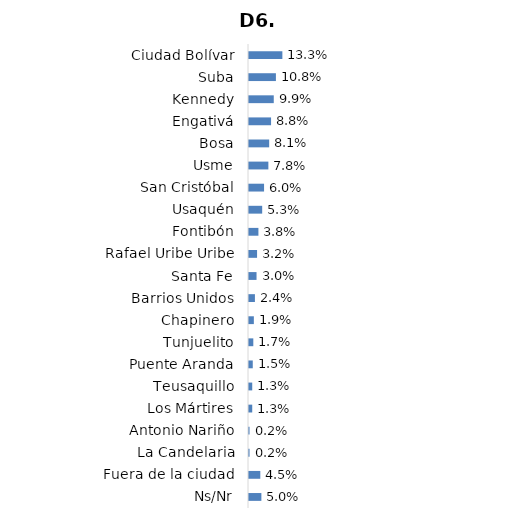
| Category | Series 0 |
|---|---|
| Ciudad Bolívar | 0.133 |
| Suba | 0.108 |
| Kennedy | 0.099 |
| Engativá | 0.088 |
| Bosa | 0.081 |
| Usme | 0.078 |
| San Cristóbal | 0.06 |
| Usaquén | 0.053 |
| Fontibón | 0.038 |
| Rafael Uribe Uribe | 0.032 |
| Santa Fe | 0.03 |
| Barrios Unidos | 0.024 |
| Chapinero | 0.019 |
| Tunjuelito | 0.017 |
| Puente Aranda | 0.015 |
| Teusaquillo | 0.013 |
| Los Mártires | 0.013 |
| Antonio Nariño | 0.002 |
| La Candelaria | 0.002 |
| Fuera de la ciudad | 0.045 |
| Ns/Nr | 0.05 |